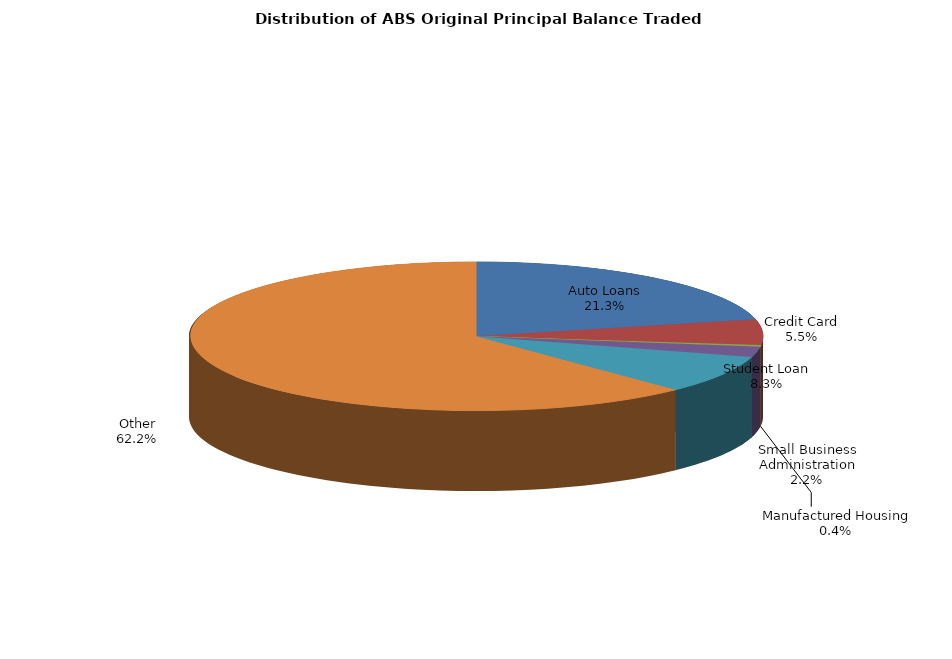
| Category | Series 0 |
|---|---|
| Auto Loans | 512284151.451 |
| Credit Card | 132773377.605 |
| Manufactured Housing | 9129523.13 |
| Small Business Administration | 53495798.799 |
| Student Loan | 199052577.115 |
| Other | 1493307414.706 |